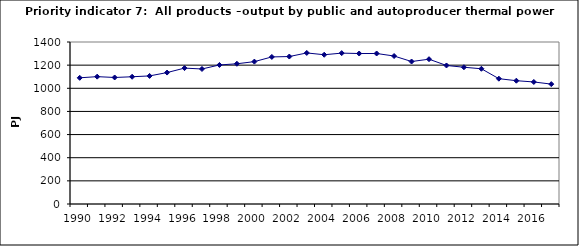
| Category | All products –output by public and autoproducer thermal power stations, PJ |
|---|---|
| 1990 | 1090.57 |
| 1991 | 1100.534 |
| 1992 | 1093.374 |
| 1993 | 1099.559 |
| 1994 | 1106.914 |
| 1995 | 1135.836 |
| 1996 | 1174.446 |
| 1997 | 1166.879 |
| 1998 | 1201.55 |
| 1999 | 1211.789 |
| 2000 | 1230.419 |
| 2001 | 1271.005 |
| 2002 | 1274.377 |
| 2003 | 1305.361 |
| 2004 | 1289.928 |
| 2005 | 1303.964 |
| 2006 | 1300.435 |
| 2007 | 1300.742 |
| 2008 | 1278.86 |
| 2009 | 1231.239 |
| 2010 | 1251.387 |
| 2011 | 1197.141 |
| 2012 | 1181.848 |
| 2013 | 1168.641 |
| 2014 | 1082.959 |
| 2015 | 1065.566 |
| 2016 | 1054.596 |
| 2017 | 1036.066 |